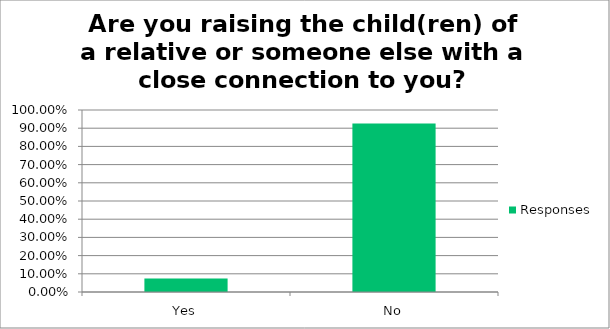
| Category | Responses |
|---|---|
| Yes | 0.074 |
| No | 0.926 |